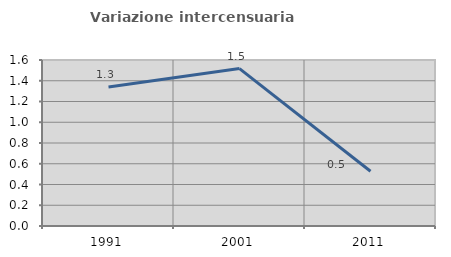
| Category | Variazione intercensuaria annua |
|---|---|
| 1991.0 | 1.339 |
| 2001.0 | 1.517 |
| 2011.0 | 0.527 |